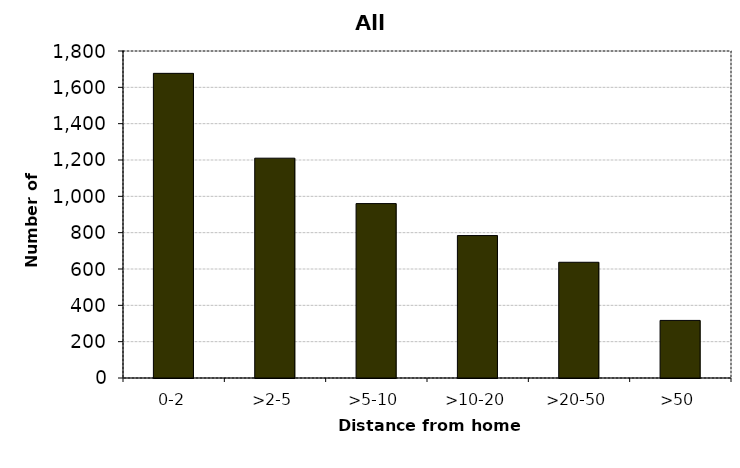
| Category | All drivers |
|---|---|
| 0-2 | 1677 |
| >2-5 | 1210 |
| >5-10 | 960 |
| >10-20 | 784 |
| >20-50 | 637 |
| >50 | 317 |